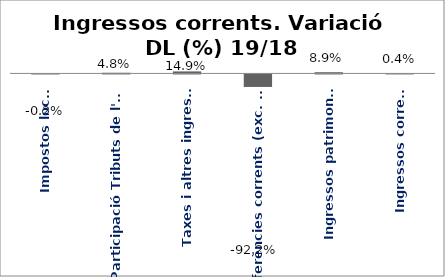
| Category | Series 0 |
|---|---|
| Impostos locals | -0.002 |
| Participació Tributs de l'Estat | 0.048 |
| Taxes i altres ingressos | 0.149 |
| Transferències corrents (exc. FCF) | -0.922 |
| Ingressos patrimonials | 0.089 |
| Ingressos corrents | 0.004 |